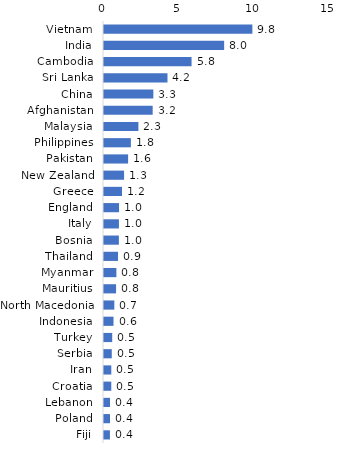
| Category | Series 0 |
|---|---|
| Vietnam | 9.848 |
| India | 7.975 |
| Cambodia | 5.812 |
| Sri Lanka | 4.214 |
| China | 3.276 |
| Afghanistan | 3.231 |
| Malaysia | 2.284 |
| Philippines | 1.784 |
| Pakistan | 1.601 |
| New Zealand | 1.332 |
| Greece | 1.193 |
| England | 1 |
| Italy | 0.991 |
| Bosnia | 0.988 |
| Thailand | 0.932 |
| Myanmar | 0.822 |
| Mauritius | 0.801 |
| North Macedonia | 0.686 |
| Indonesia | 0.631 |
| Turkey | 0.545 |
| Serbia | 0.516 |
| Iran | 0.485 |
| Croatia | 0.483 |
| Lebanon | 0.399 |
| Poland | 0.397 |
| Fiji | 0.393 |